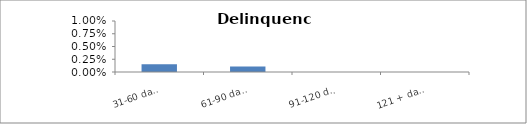
| Category | Series 0 |
|---|---|
| 31-60 days | 0.002 |
| 61-90 days | 0.001 |
| 91-120 days | 0 |
| 121 + days | 0 |